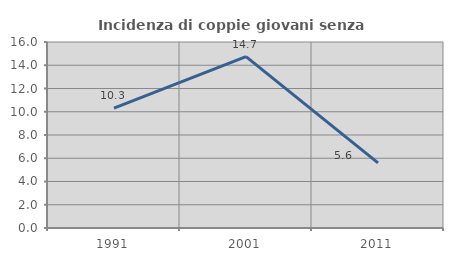
| Category | Incidenza di coppie giovani senza figli |
|---|---|
| 1991.0 | 10.314 |
| 2001.0 | 14.747 |
| 2011.0 | 5.608 |